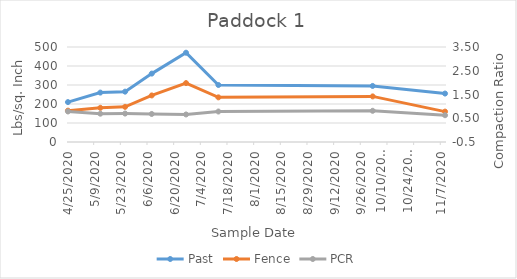
| Category | Past | Fence |
|---|---|---|
| 4/25/20 | 210 | 165 |
| 5/12/20 | 260 | 180 |
| 5/25/20 | 265 | 185 |
| 6/8/20 | 360 | 245 |
| 6/26/20 | 470 | 310 |
| 7/13/20 | 300 | 235 |
| 10/2/20 | 295 | 240 |
| 11/9/20 | 255 | 160 |